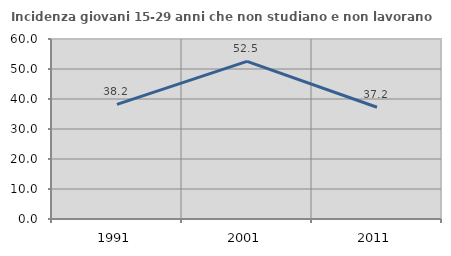
| Category | Incidenza giovani 15-29 anni che non studiano e non lavorano  |
|---|---|
| 1991.0 | 38.221 |
| 2001.0 | 52.55 |
| 2011.0 | 37.246 |